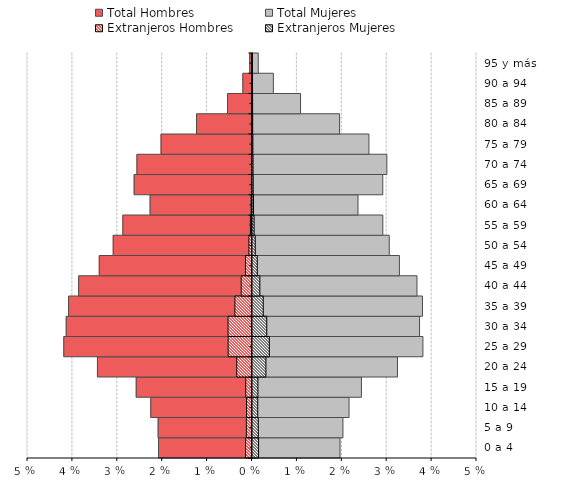
| Category | Total Hombres | Total Mujeres | Extranjeros Hombres | Extranjeros Mujeres |
|---|---|---|---|---|
| 0 a 4 | -0.021 | 0.019 | -0.001 | 0.001 |
| 5 a 9 | -0.021 | 0.02 | -0.001 | 0.001 |
| 10 a 14 | -0.023 | 0.021 | -0.001 | 0.001 |
| 15 a 19 | -0.026 | 0.024 | -0.001 | 0.001 |
| 20 a 24 | -0.034 | 0.032 | -0.003 | 0.003 |
| 25 a 29 | -0.042 | 0.038 | -0.005 | 0.004 |
| 30 a 34 | -0.041 | 0.037 | -0.005 | 0.003 |
| 35 a 39 | -0.041 | 0.038 | -0.004 | 0.002 |
| 40 a 44 | -0.039 | 0.037 | -0.002 | 0.002 |
| 45 a 49 | -0.034 | 0.033 | -0.001 | 0.001 |
| 50 a 54 | -0.031 | 0.03 | -0.001 | 0.001 |
| 55 a 59 | -0.029 | 0.029 | 0 | 0 |
| 60 a 64 | -0.023 | 0.023 | 0 | 0 |
| 65 a 69 | -0.026 | 0.029 | 0 | 0 |
| 70 a 74 | -0.026 | 0.03 | 0 | 0 |
| 75 a 79 | -0.02 | 0.026 | 0 | 0 |
| 80 a 84 | -0.012 | 0.019 | 0 | 0 |
| 85 a 89 | -0.005 | 0.011 | 0 | 0 |
| 90 a 94 | -0.002 | 0.005 | 0 | 0 |
| 95 y más | -0.001 | 0.001 | 0 | 0 |